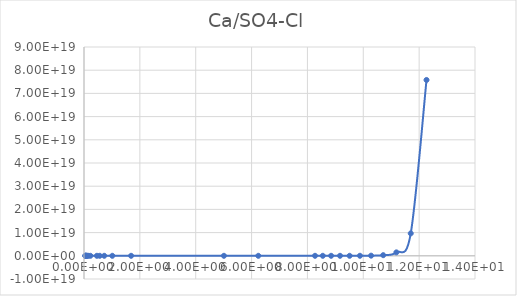
| Category | Series 0 |
|---|---|
| 0.045798 | 14.779 |
| 0.050886 | 15.027 |
| 0.057258 | 15.316 |
| 0.065456 | 15.662 |
| 0.076369 | 16.09 |
| 0.091683 | 16.655 |
| 0.11463 | 17.466 |
| 0.15298 | 18.825 |
| 0.2297 | 21.857 |
| 0.46159 | 36.624 |
| 0.56399 | 47.55 |
| 0.72477 | 74.05 |
| 1.0138 | 176.777 |
| 1.6863 | 1636.784 |
| 5.0106 | 266993066.083 |
| 6.241 | 24284520955.909 |
| 8.2722 | 39973674655047.2 |
| 8.5505 | 109193054136874.36 |
| 8.8482 | 319083813701984.44 |
| 9.1674 | 1005651768121953.9 |
| 9.5104 | 3453372333103923 |
| 9.8801 | 13078518891054254 |
| 10.28 | 55389190852220288 |
| 10.713 | 266336539828460448 |
| 11.185 | 1478436317780580096 |
| 11.699 | 9653447800574961664 |
| 12.264 | 75791461363703414784 |